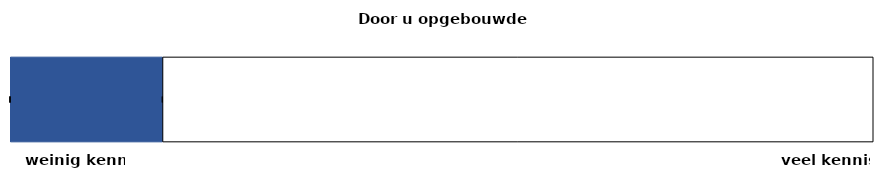
| Category | kennis uit opleiding | beroepskennis | interesse in financiën | maximale score |
|---|---|---|---|---|
| 0 | 0 | 0 | 0.176 | 0.824 |